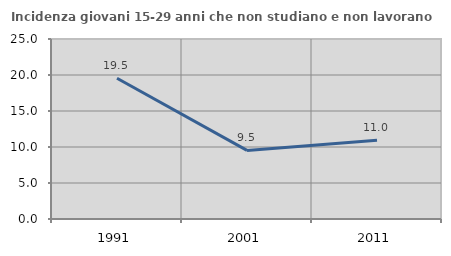
| Category | Incidenza giovani 15-29 anni che non studiano e non lavorano  |
|---|---|
| 1991.0 | 19.545 |
| 2001.0 | 9.528 |
| 2011.0 | 10.953 |